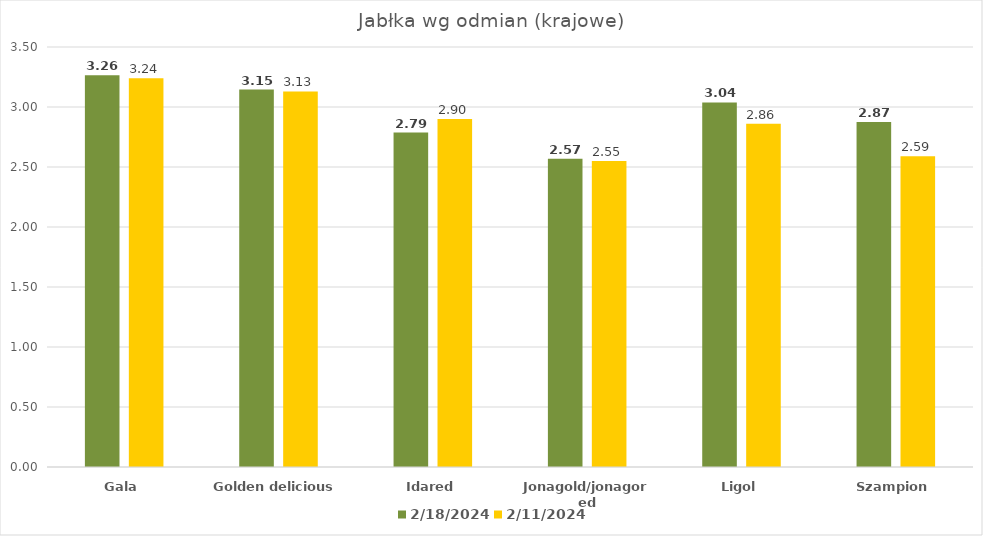
| Category | 18.02.2024 | 11.02.2024 |
|---|---|---|
| Gala | 3.264 | 3.24 |
| Golden delicious | 3.146 | 3.13 |
| Idared | 2.787 | 2.9 |
| Jonagold/jonagored | 2.57 | 2.55 |
| Ligol | 3.038 | 2.86 |
| Szampion | 2.875 | 2.59 |